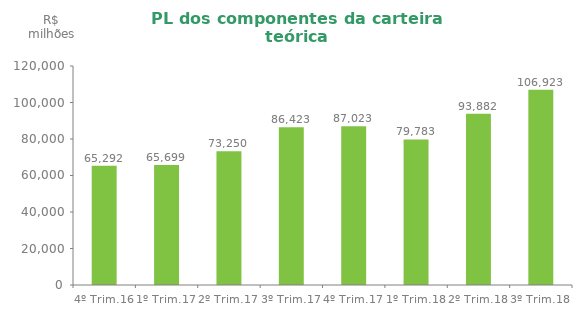
| Category | Series 0 |
|---|---|
| 4º Trim.16 | 65292.199 |
| 1º Trim.17 | 65699.44 |
| 2º Trim.17 | 73250.496 |
| 3º Trim.17 | 86422.542 |
| 4º Trim.17 | 87022.625 |
| 1º Trim.18 | 79783.188 |
| 2º Trim.18 | 93882.016 |
| 3º Trim.18 | 106923.21 |